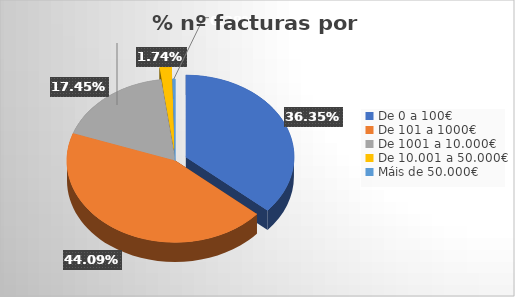
| Category | Series 0 | Series 1 | Series 2 | Series 3 | Series 4 |
|---|---|---|---|---|---|
| De 0 a 100€ | 0.363 | 0.024 | 0.159 | 0.01 | 0.363 |
| De 101 a 1000€ | 0.441 | 0.045 | 0.121 | 0.027 | 0.441 |
| De 1001 a 10.000€ | 0.174 | 0.026 | 0.056 | 0.011 | 0.174 |
| De 10.001 a 50.000€ | 0.017 | 0.002 | 0.009 | 0.001 | 0.017 |
| Máis de 50.000€ | 0.004 | 0 | 0.003 | 0 | 0.004 |